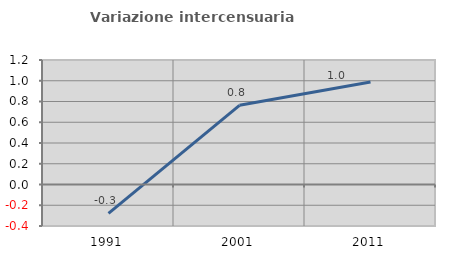
| Category | Variazione intercensuaria annua |
|---|---|
| 1991.0 | -0.278 |
| 2001.0 | 0.763 |
| 2011.0 | 0.988 |